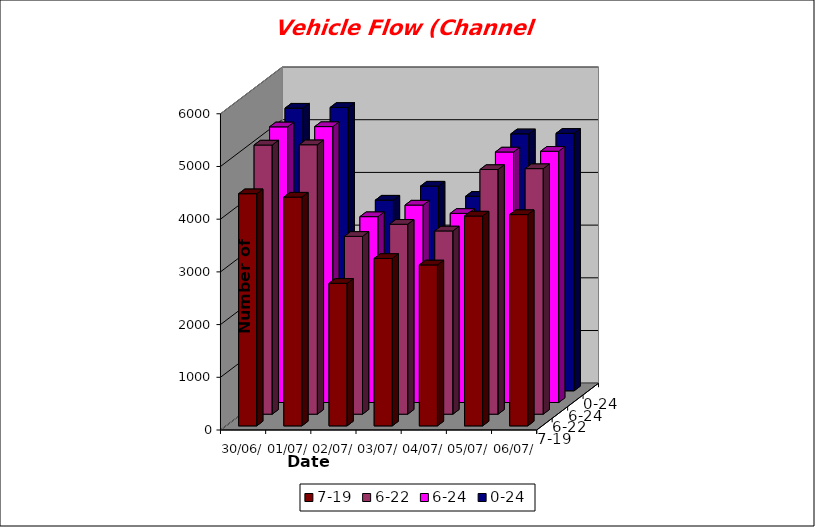
| Category | 7-19 | 6-22 | 6-24 | 0-24 |
|---|---|---|---|---|
| 30/06/2021 | 4405 | 5107 | 5230 | 5363 |
| 01/07/2021 | 4341 | 5112 | 5235 | 5377 |
| 02/07/2021 | 2705 | 3374 | 3526 | 3618 |
| 03/07/2021 | 3177 | 3604 | 3746 | 3884 |
| 04/07/2021 | 3054 | 3477 | 3588 | 3692 |
| 05/07/2021 | 3982 | 4642 | 4753 | 4876 |
| 06/07/2021 | 4009 | 4659 | 4767 | 4885 |